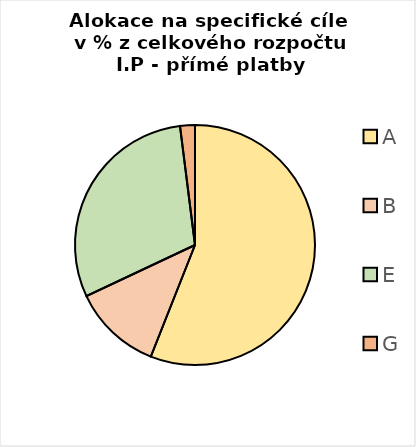
| Category | Series 0 |
|---|---|
| A | 0.56 |
| B | 0.12 |
| E | 0.3 |
| G | 0.02 |